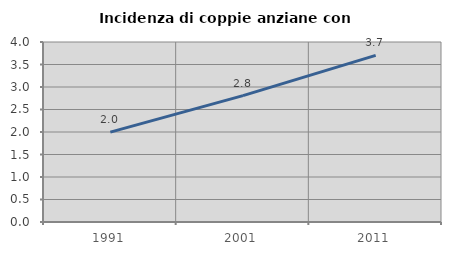
| Category | Incidenza di coppie anziane con figli |
|---|---|
| 1991.0 | 1.998 |
| 2001.0 | 2.809 |
| 2011.0 | 3.704 |